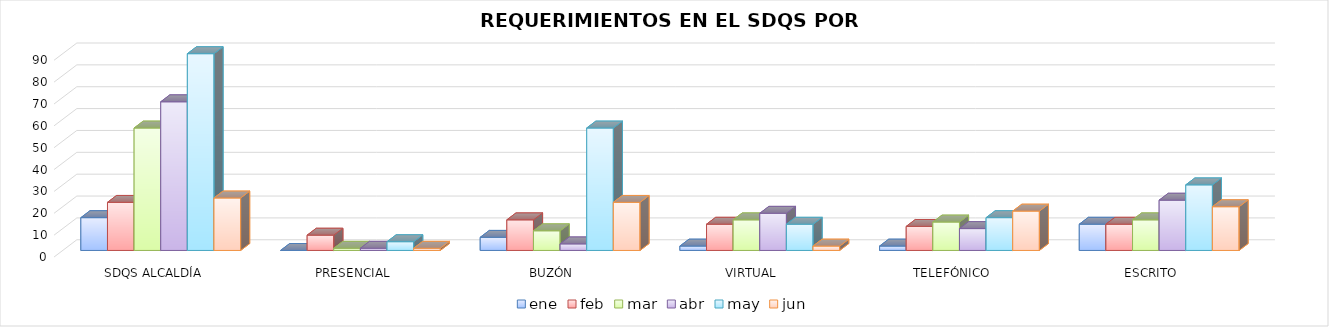
| Category | ene | feb | mar | abr | may | jun |
|---|---|---|---|---|---|---|
| SDQS ALCALDÍA | 15 | 22 | 56 | 68 | 90 | 24 |
| PRESENCIAL | 0 | 7 | 1 | 1 | 4 | 1 |
| BUZÓN | 6 | 14 | 9 | 3 | 56 | 22 |
| VIRTUAL | 2 | 12 | 14 | 17 | 12 | 2 |
| TELEFÓNICO | 2 | 11 | 13 | 10 | 15 | 18 |
| ESCRITO | 12 | 12 | 14 | 23 | 30 | 20 |